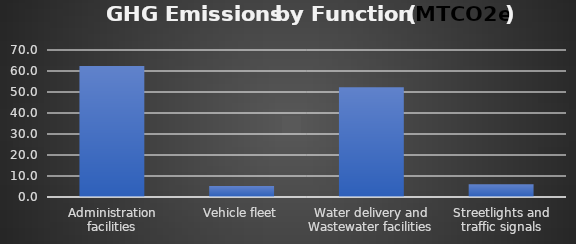
| Category | GHG Emissions (tons) |
|---|---|
| Administration facilities | 62.33 |
| Vehicle fleet | 5.246 |
| Water delivery and Wastewater facilities | 52.244 |
| Streetlights and traffic signals | 6.12 |